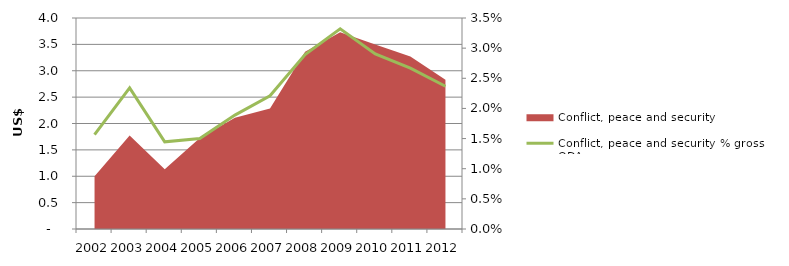
| Category | Conflict, peace and security % gross ODA |
|---|---|
| 0 | 0.016 |
| 1 | 0.023 |
| 2 | 0.014 |
| 3 | 0.015 |
| 4 | 0.019 |
| 5 | 0.022 |
| 6 | 0.029 |
| 7 | 0.033 |
| 8 | 0.029 |
| 9 | 0.027 |
| 10 | 0.024 |